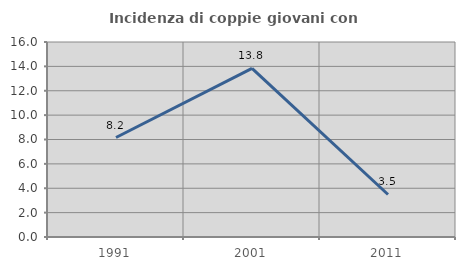
| Category | Incidenza di coppie giovani con figli |
|---|---|
| 1991.0 | 8.163 |
| 2001.0 | 13.83 |
| 2011.0 | 3.488 |